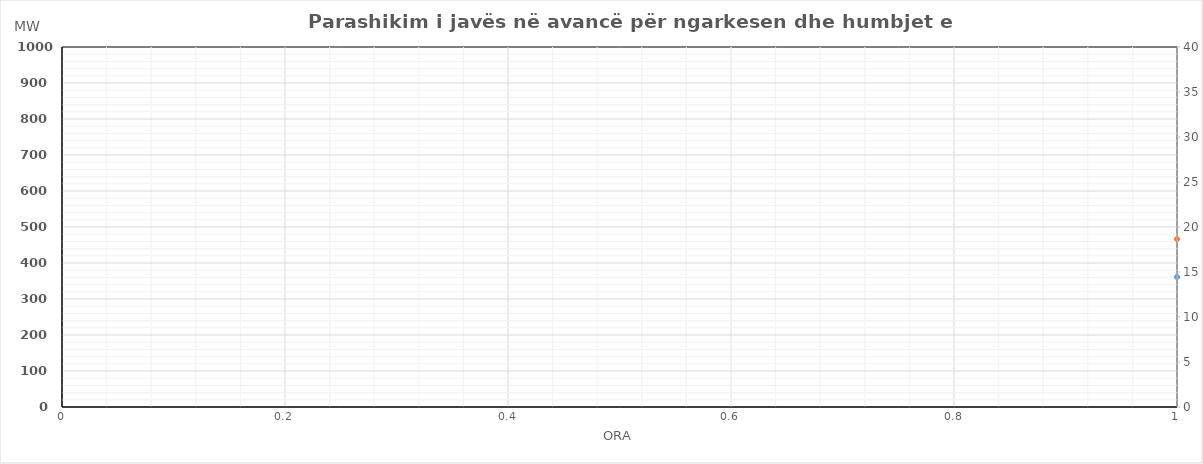
| Category | Ngarkesa (MWh) |
|---|---|
| 0 | 466.539 |
| 1 | 428.974 |
| 2 | 411.19 |
| 3 | 405.574 |
| 4 | 414.183 |
| 5 | 443.495 |
| 6 | 515.84 |
| 7 | 630.46 |
| 8 | 715.897 |
| 9 | 733.927 |
| 10 | 720.396 |
| 11 | 715.811 |
| 12 | 717.871 |
| 13 | 713.991 |
| 14 | 687.506 |
| 15 | 661.981 |
| 16 | 679.753 |
| 17 | 720.073 |
| 18 | 824.959 |
| 19 | 876.364 |
| 20 | 828.285 |
| 21 | 744.21 |
| 22 | 639.729 |
| 23 | 537.405 |
| 24 | 466.144 |
| 25 | 430.49 |
| 26 | 415.271 |
| 27 | 411.234 |
| 28 | 418.914 |
| 29 | 459.839 |
| 30 | 552.913 |
| 31 | 684.799 |
| 32 | 784.194 |
| 33 | 789.069 |
| 34 | 760.954 |
| 35 | 750.087 |
| 36 | 748.265 |
| 37 | 748.414 |
| 38 | 728.097 |
| 39 | 703.487 |
| 40 | 702.393 |
| 41 | 729.218 |
| 42 | 813.333 |
| 43 | 854.074 |
| 44 | 792.468 |
| 45 | 718.493 |
| 46 | 621.817 |
| 47 | 529.631 |
| 48 | 458.258 |
| 49 | 423.016 |
| 50 | 407.953 |
| 51 | 403.787 |
| 52 | 411.143 |
| 53 | 455.96 |
| 54 | 575.711 |
| 55 | 735.208 |
| 56 | 780.891 |
| 57 | 761.441 |
| 58 | 740.233 |
| 59 | 726.196 |
| 60 | 716.726 |
| 61 | 717.866 |
| 62 | 710.361 |
| 63 | 702.696 |
| 64 | 693.901 |
| 65 | 727.148 |
| 66 | 807.616 |
| 67 | 842.728 |
| 68 | 794.484 |
| 69 | 717.5 |
| 70 | 623.806 |
| 71 | 535.694 |
| 72 | 457.617 |
| 73 | 421.578 |
| 74 | 405.032 |
| 75 | 402.439 |
| 76 | 410.853 |
| 77 | 455.288 |
| 78 | 575.796 |
| 79 | 739.283 |
| 80 | 786.3 |
| 81 | 774.42 |
| 82 | 745.732 |
| 83 | 729.739 |
| 84 | 713.986 |
| 85 | 721.902 |
| 86 | 714.927 |
| 87 | 706.751 |
| 88 | 702.292 |
| 89 | 733.21 |
| 90 | 825.947 |
| 91 | 864.925 |
| 92 | 817.515 |
| 93 | 738.647 |
| 94 | 626.647 |
| 95 | 529.534 |
| 96 | 462.398 |
| 97 | 425.995 |
| 98 | 409.571 |
| 99 | 404.68 |
| 100 | 412.663 |
| 101 | 449.727 |
| 102 | 545.775 |
| 103 | 682.834 |
| 104 | 748.394 |
| 105 | 747.684 |
| 106 | 730.315 |
| 107 | 721.003 |
| 108 | 717.299 |
| 109 | 715.928 |
| 110 | 698.934 |
| 111 | 682.339 |
| 112 | 686.827 |
| 113 | 723.611 |
| 114 | 816.288 |
| 115 | 859.546 |
| 116 | 811.385 |
| 117 | 730.855 |
| 118 | 631.768 |
| 119 | 536.55 |
| 120 | 460.328 |
| 121 | 424.506 |
| 122 | 408.762 |
| 123 | 404.234 |
| 124 | 411.903 |
| 125 | 452.844 |
| 126 | 560.743 |
| 127 | 709.021 |
| 128 | 764.642 |
| 129 | 754.562 |
| 130 | 735.274 |
| 131 | 723.6 |
| 132 | 717.013 |
| 133 | 716.897 |
| 134 | 704.647 |
| 135 | 692.518 |
| 136 | 690.364 |
| 137 | 725.38 |
| 138 | 811.952 |
| 139 | 851.137 |
| 140 | 802.934 |
| 141 | 724.177 |
| 142 | 627.787 |
| 143 | 536.122 |
| 144 | 458.973 |
| 145 | 423.042 |
| 146 | 406.897 |
| 147 | 403.336 |
| 148 | 411.378 |
| 149 | 454.066 |
| 150 | 568.27 |
| 151 | 724.152 |
| 152 | 775.471 |
| 153 | 764.491 |
| 154 | 740.503 |
| 155 | 726.669 |
| 156 | 715.499 |
| 157 | 719.4 |
| 158 | 709.787 |
| 159 | 699.634 |
| 160 | 696.328 |
| 161 | 729.295 |
| 162 | 818.95 |
| 163 | 858.031 |
| 164 | 810.224 |
| 165 | 731.412 |
| 166 | 627.217 |
| 167 | 532.828 |